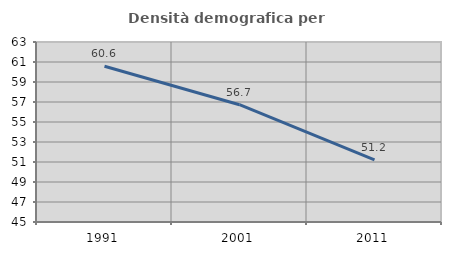
| Category | Densità demografica |
|---|---|
| 1991.0 | 60.57 |
| 2001.0 | 56.73 |
| 2011.0 | 51.214 |